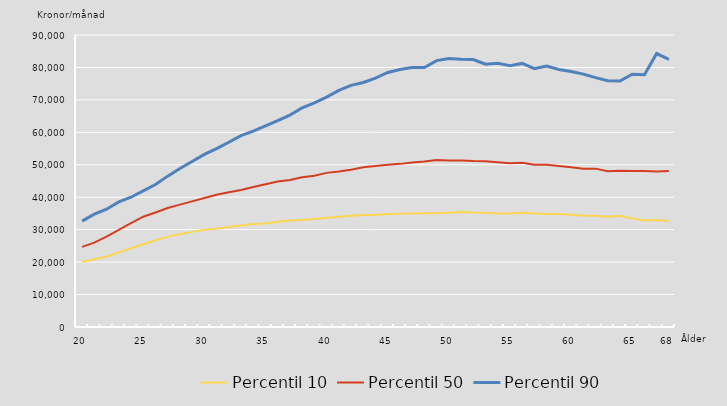
| Category | Percentil 10 | Percentil 50 | Percentil 90 |
|---|---|---|---|
| 20.0 | 20017 | 24687 | 32625 |
| nan | 20880 | 26000 | 34765 |
| nan | 21750 | 27840 | 36300 |
| nan | 23000 | 29962 | 38540 |
| nan | 24292 | 32000 | 40000 |
| 25.0 | 25500 | 34000 | 41938 |
| nan | 26738 | 35292 | 43928 |
| nan | 27853 | 36688 | 46500 |
| nan | 28615 | 37722 | 48856 |
| nan | 29317 | 38726 | 51000 |
| 30.0 | 30000 | 39771 | 53201 |
| nan | 30295 | 40768 | 55000 |
| nan | 30817 | 41524 | 56937 |
| nan | 31263 | 42203 | 59000 |
| nan | 31758 | 43134 | 60357 |
| 35.0 | 31900 | 44000 | 62000 |
| nan | 32406 | 44851 | 63587 |
| nan | 32811 | 45300 | 65311 |
| nan | 33000 | 46180 | 67574 |
| nan | 33264 | 46596 | 69092 |
| 40.0 | 33700 | 47507 | 70862 |
| nan | 34000 | 47900 | 72908 |
| nan | 34300 | 48500 | 74462 |
| nan | 34517 | 49268 | 75353 |
| nan | 34500 | 49630 | 76719 |
| 45.0 | 34807 | 50000 | 78462 |
| nan | 34926 | 50280 | 79390 |
| nan | 35000 | 50715 | 80000 |
| nan | 35050 | 51000 | 80000 |
| nan | 35050 | 51452 | 82109 |
| 50.0 | 35233 | 51341 | 82772 |
| nan | 35450 | 51315 | 82500 |
| nan | 35300 | 51131 | 82440 |
| nan | 35243 | 51063 | 81000 |
| nan | 35018 | 50793 | 81306 |
| 55.0 | 35000 | 50496 | 80564 |
| nan | 35200 | 50600 | 81243 |
| nan | 35000 | 50000 | 79600 |
| nan | 34850 | 50000 | 80401 |
| nan | 34850 | 49615 | 79377 |
| 60.0 | 34631 | 49248 | 78743 |
| nan | 34300 | 48811 | 77950 |
| nan | 34269 | 48810 | 76873 |
| nan | 34000 | 48021 | 75910 |
| nan | 34266 | 48185 | 75805 |
| 65.0 | 33460 | 48069 | 77925 |
| nan | 32856 | 48055 | 77743 |
| nan | 33010 | 47937 | 84281 |
| 68.0 | 32670 | 48106 | 82500 |